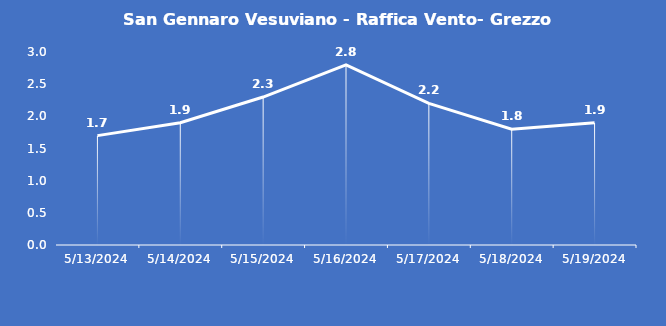
| Category | San Gennaro Vesuviano - Raffica Vento- Grezzo (m/s) |
|---|---|
| 5/13/24 | 1.7 |
| 5/14/24 | 1.9 |
| 5/15/24 | 2.3 |
| 5/16/24 | 2.8 |
| 5/17/24 | 2.2 |
| 5/18/24 | 1.8 |
| 5/19/24 | 1.9 |